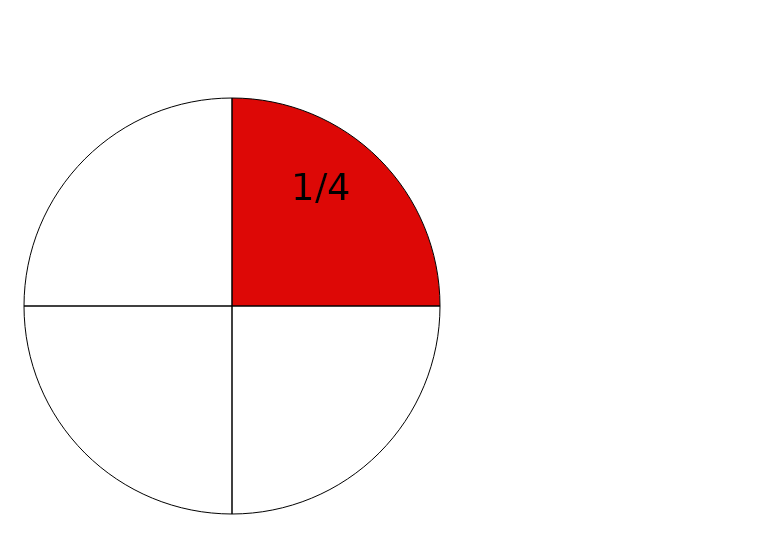
| Category | Value |
|---|---|
| 0 | 0.25 |
| 1 | 0.25 |
| 2 | 0.25 |
| 3 | 0.25 |